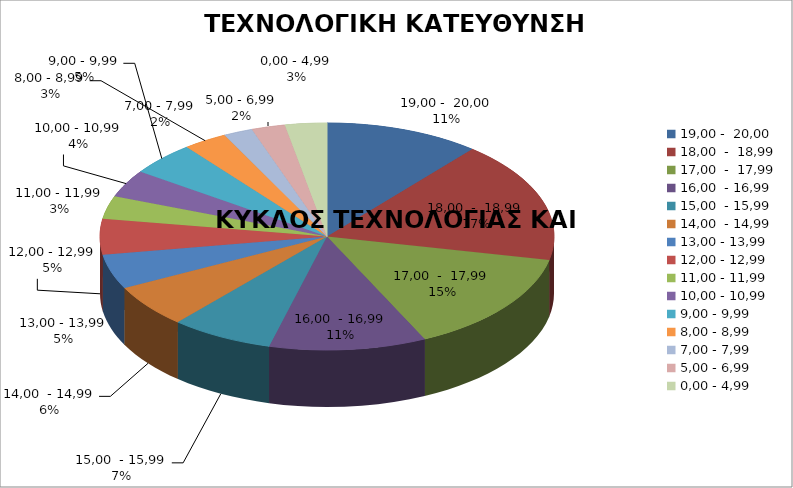
| Category | ΤΕΧΝΟΛΟΓΙΚΗ ΚΑΤΕΥΘΥΝΣΗ - 2010 |
|---|---|
| 19,00 -  20,00 | 11.028 |
| 18,00  -  18,99 | 17.288 |
| 17,00  -  17,99 | 14.605 |
| 16,00  - 16,99 | 11.177 |
| 15,00  - 15,99 | 7.303 |
| 14,00  - 14,99 | 6.11 |
| 13,00 - 13,99 | 4.918 |
| 12,00 - 12,99 | 5.067 |
| 11,00 - 11,99 | 3.279 |
| 10,00 - 10,99 | 3.875 |
| 9,00 - 9,99 | 4.769 |
| 8,00 - 8,99 | 3.13 |
| 7,00 - 7,99 | 2.086 |
| 5,00 - 6,99 | 2.385 |
| 0,00 - 4,99 | 2.981 |